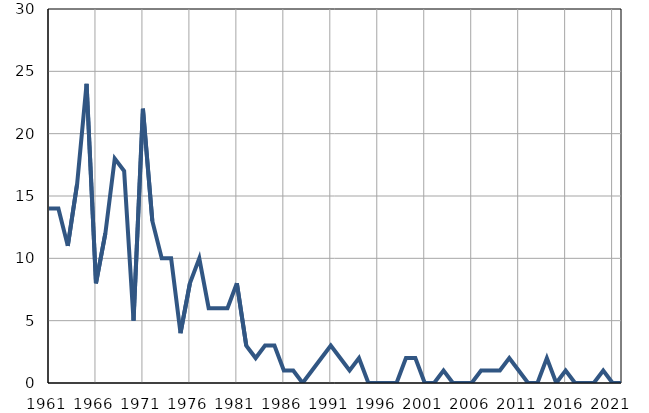
| Category | Умрла 
одојчад |
|---|---|
| 1961.0 | 14 |
| 1962.0 | 14 |
| 1963.0 | 11 |
| 1964.0 | 16 |
| 1965.0 | 24 |
| 1966.0 | 8 |
| 1967.0 | 12 |
| 1968.0 | 18 |
| 1969.0 | 17 |
| 1970.0 | 5 |
| 1971.0 | 22 |
| 1972.0 | 13 |
| 1973.0 | 10 |
| 1974.0 | 10 |
| 1975.0 | 4 |
| 1976.0 | 8 |
| 1977.0 | 10 |
| 1978.0 | 6 |
| 1979.0 | 6 |
| 1980.0 | 6 |
| 1981.0 | 8 |
| 1982.0 | 3 |
| 1983.0 | 2 |
| 1984.0 | 3 |
| 1985.0 | 3 |
| 1986.0 | 1 |
| 1987.0 | 1 |
| 1988.0 | 0 |
| 1989.0 | 1 |
| 1990.0 | 2 |
| 1991.0 | 3 |
| 1992.0 | 2 |
| 1993.0 | 1 |
| 1994.0 | 2 |
| 1995.0 | 0 |
| 1996.0 | 0 |
| 1997.0 | 0 |
| 1998.0 | 0 |
| 1999.0 | 2 |
| 2000.0 | 2 |
| 2001.0 | 0 |
| 2002.0 | 0 |
| 2003.0 | 1 |
| 2004.0 | 0 |
| 2005.0 | 0 |
| 2006.0 | 0 |
| 2007.0 | 1 |
| 2008.0 | 1 |
| 2009.0 | 1 |
| 2010.0 | 2 |
| 2011.0 | 1 |
| 2012.0 | 0 |
| 2013.0 | 0 |
| 2014.0 | 2 |
| 2015.0 | 0 |
| 2016.0 | 1 |
| 2017.0 | 0 |
| 2018.0 | 0 |
| 2019.0 | 0 |
| 2020.0 | 1 |
| 2021.0 | 0 |
| 2022.0 | 0 |